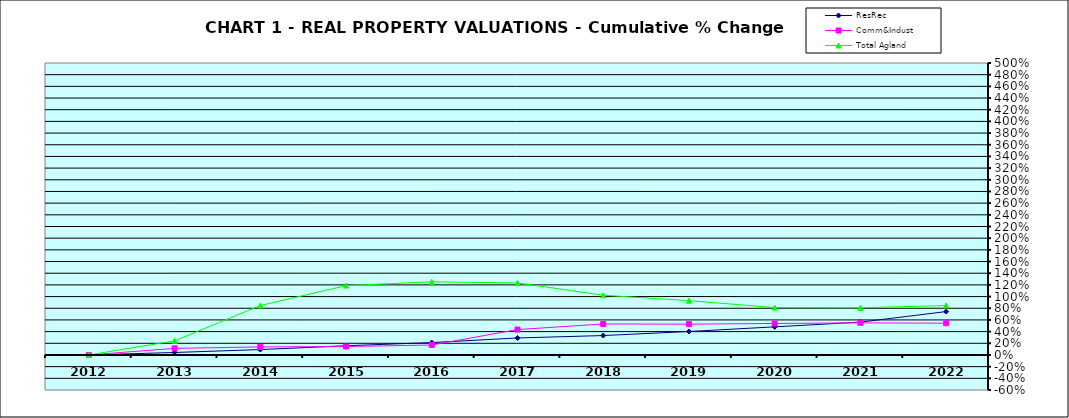
| Category | ResRec | Comm&Indust | Total Agland |
|---|---|---|---|
| 2012.0 | 0 | 0 | 0 |
| 2013.0 | 0.042 | 0.113 | 0.242 |
| 2014.0 | 0.092 | 0.138 | 0.846 |
| 2015.0 | 0.158 | 0.145 | 1.188 |
| 2016.0 | 0.212 | 0.17 | 1.252 |
| 2017.0 | 0.291 | 0.435 | 1.233 |
| 2018.0 | 0.333 | 0.531 | 1.023 |
| 2019.0 | 0.402 | 0.528 | 0.93 |
| 2020.0 | 0.481 | 0.539 | 0.811 |
| 2021.0 | 0.562 | 0.55 | 0.808 |
| 2022.0 | 0.743 | 0.544 | 0.847 |